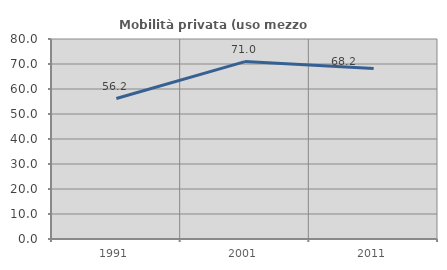
| Category | Mobilità privata (uso mezzo privato) |
|---|---|
| 1991.0 | 56.18 |
| 2001.0 | 70.968 |
| 2011.0 | 68.182 |